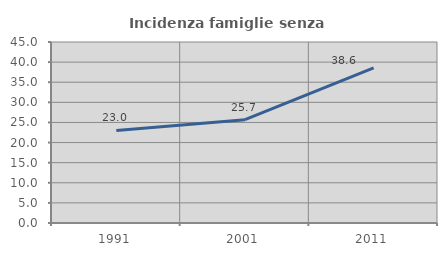
| Category | Incidenza famiglie senza nuclei |
|---|---|
| 1991.0 | 23.026 |
| 2001.0 | 25.676 |
| 2011.0 | 38.562 |